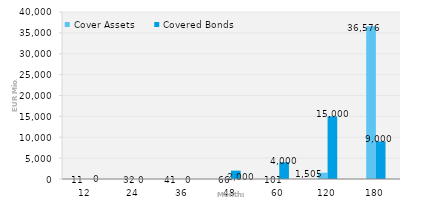
| Category | Cover Assets | Covered Bonds |
|---|---|---|
| 12.0 | 10.977 | 0 |
| 24.0 | 31.914 | 0 |
| 36.0 | 41.163 | 0 |
| 48.0 | 66.344 | 2000 |
| 60.0 | 100.958 | 4000 |
| 120.0 | 1504.997 | 15000 |
| 180.0 | 36575.841 | 9000 |